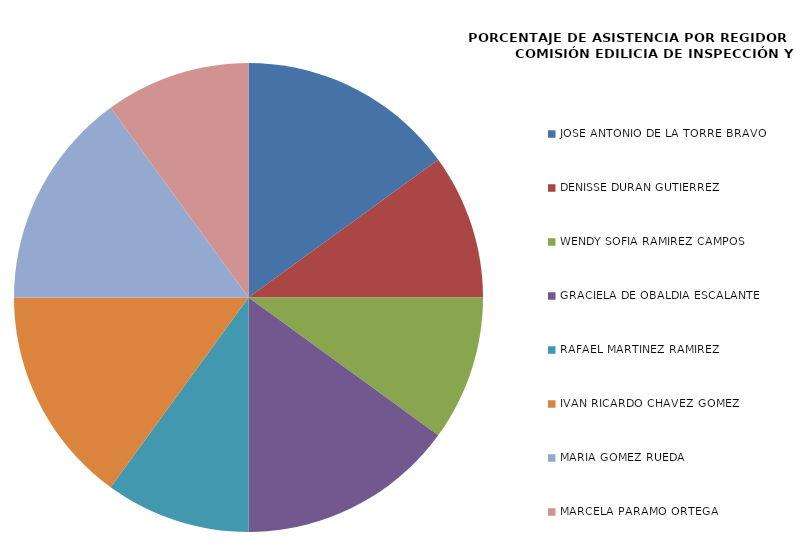
| Category | Series 0 |
|---|---|
| JOSÉ ANTONIO DE LA TORRE BRAVO | 100 |
| DENISSE DURÁN GUTIÉRREZ | 66.667 |
| WENDY SOFÍA RAMÍREZ CAMPOS | 66.667 |
| GRACIELA DE OBALDÍA ESCALANTE | 100 |
| RAFAEL MARTÍNEZ RAMÍREZ | 66.667 |
| IVÁN RICARDO CHÁVEZ GÓMEZ | 100 |
| MARÍA GÓMEZ RUEDA | 100 |
| MARCELA PARAMO ORTEGA | 66.667 |